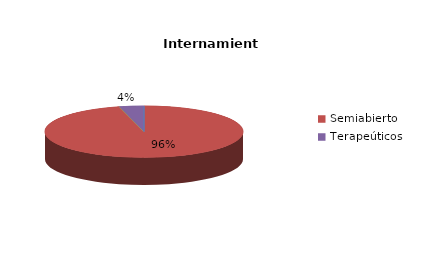
| Category | Series 0 |
|---|---|
| Cerrado | 0 |
| Semiabierto | 24 |
| Abierto | 0 |
| Terapeúticos | 1 |